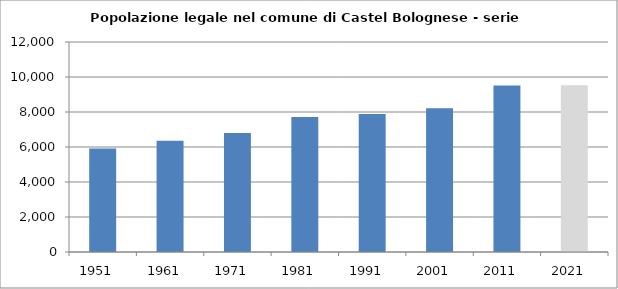
| Category | Popolazione residente |
|---|---|
| 1951   | 5913 |
| 1961   | 6362 |
| 1971   | 6799 |
| 1981   | 7716 |
| 1991   | 7891 |
| 2001   | 8212 |
| 2011   | 9519 |
| 2021   | 9535 |